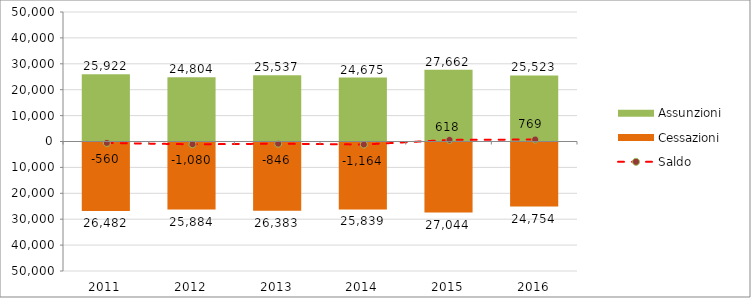
| Category | Assunzioni | Cessazioni |
|---|---|---|
| 2011.0 | 25922 | -26482 |
| 2012.0 | 24804 | -25884 |
| 2013.0 | 25537 | -26383 |
| 2014.0 | 24675 | -25839 |
| 2015.0 | 27662 | -27044 |
| 2016.0 | 25523 | -24754 |